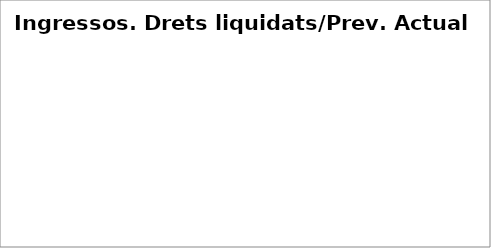
| Category | Series 0 |
|---|---|
| Impostos directes | 0.611 |
| Impostos indirectes | 0.654 |
| Taxes, preus públics i altres ingressos | 0.466 |
| Transferències corrents | 0.562 |
| Ingressos patrimonials | 0.366 |
| Venda d'inversions reals | 0.312 |
| Transferències de capital | 0.181 |
| Actius financers* | 0.016 |
| Passius financers | 0.01 |